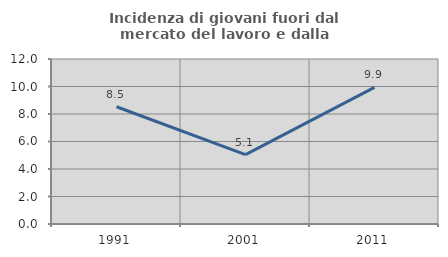
| Category | Incidenza di giovani fuori dal mercato del lavoro e dalla formazione  |
|---|---|
| 1991.0 | 8.529 |
| 2001.0 | 5.051 |
| 2011.0 | 9.94 |